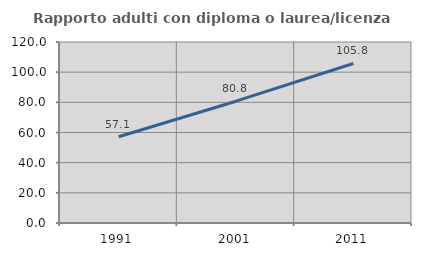
| Category | Rapporto adulti con diploma o laurea/licenza media  |
|---|---|
| 1991.0 | 57.143 |
| 2001.0 | 80.758 |
| 2011.0 | 105.76 |